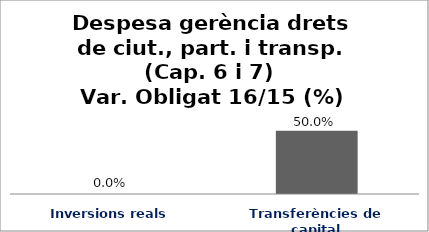
| Category | Series 0 |
|---|---|
| Inversions reals | 0 |
| Transferències de capital | 0.5 |